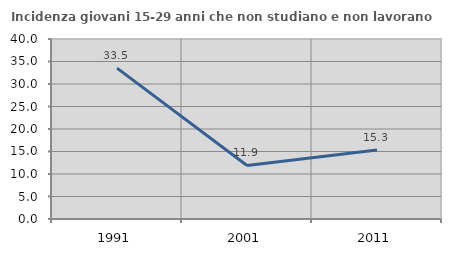
| Category | Incidenza giovani 15-29 anni che non studiano e non lavorano  |
|---|---|
| 1991.0 | 33.537 |
| 2001.0 | 11.899 |
| 2011.0 | 15.321 |